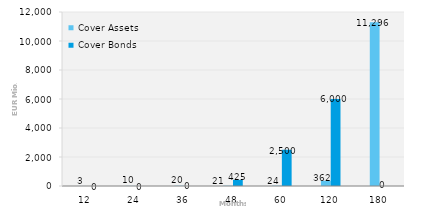
| Category | Cover Assets | Cover Bonds |
|---|---|---|
| 12.0 | 2.946 | 0 |
| 24.0 | 9.985 | 0 |
| 36.0 | 19.714 | 0 |
| 48.0 | 21.001 | 425 |
| 60.0 | 24.483 | 2500 |
| 120.0 | 361.851 | 6000 |
| 180.0 | 11295.989 | 0 |